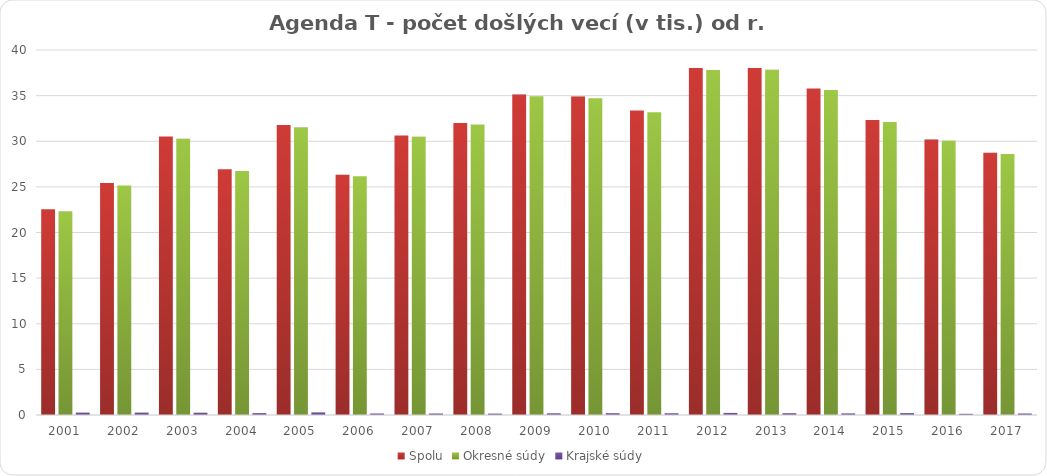
| Category | Spolu | Okresné súdy | Krajské súdy |
|---|---|---|---|
| 2001.0 | 22.56 | 22.3 | 0.26 |
| 2002.0 | 25.42 | 25.16 | 0.26 |
| 2003.0 | 30.53 | 30.28 | 0.25 |
| 2004.0 | 26.94 | 26.73 | 0.21 |
| 2005.0 | 31.79 | 31.5 | 0.29 |
| 2006.0 | 26.34 | 26.17 | 0.17 |
| 2007.0 | 30.64 | 30.48 | 0.16 |
| 2008.0 | 31.99 | 31.84 | 0.15 |
| 2009.0 | 35.12 | 34.929 | 0.19 |
| 2010.0 | 34.9 | 34.703 | 0.2 |
| 2011.0 | 33.382 | 33.188 | 0.194 |
| 2012.0 | 38.03 | 37.8 | 0.23 |
| 2013.0 | 38.03 | 37.83 | 0.2 |
| 2014.0 | 35.79 | 35.61 | 0.18 |
| 2015.0 | 32.33 | 32.12 | 0.21 |
| 2016.0 | 30.18 | 30.051 | 0.13 |
| 2017.0 | 28.75 | 28.59 | 0.16 |